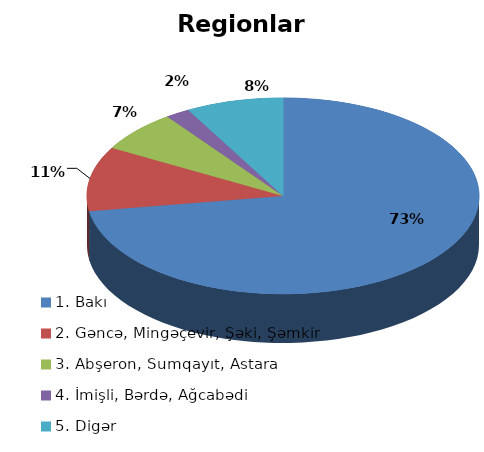
| Category | Series 0 |
|---|---|
| 1. Bakı | 0.725 |
| 2. Gəncə, Mingəçevir, Şəki, Şəmkir | 0.106 |
| 3. Abşeron, Sumqayıt, Astara | 0.068 |
| 4. İmişli, Bərdə, Ağcabədi | 0.02 |
| 5. Digər | 0.08 |